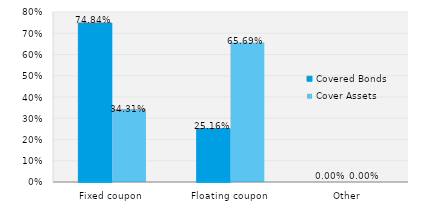
| Category | Covered Bonds | Cover Assets |
|---|---|---|
| Fixed coupon | 0.748 | 0.343 |
| Floating coupon | 0.252 | 0.657 |
| Other | 0 | 0 |